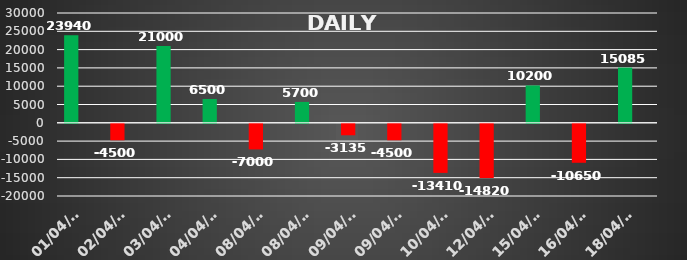
| Category | Series 0 | Series 1 |
|---|---|---|
| 2024-04-01 | 23940 |  |
| 2024-04-02 | -4500 |  |
| 2024-04-03 | 21000 |  |
| 2024-04-04 | 6500 |  |
| 2024-04-08 | -7000 |  |
| 2024-04-08 | 5700 |  |
| 2024-04-09 | -3135 |  |
| 2024-04-09 | -4500 |  |
| 2024-04-10 | -13410 |  |
| 2024-04-12 | -14820 |  |
| 2024-04-15 | 10200 |  |
| 2024-04-16 | -10650 |  |
| 2024-04-18 | 15085 |  |